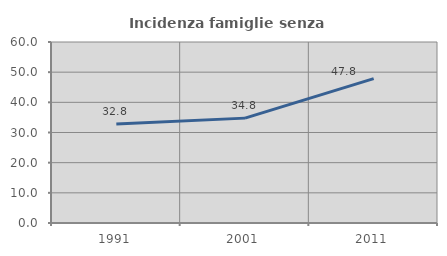
| Category | Incidenza famiglie senza nuclei |
|---|---|
| 1991.0 | 32.781 |
| 2001.0 | 34.766 |
| 2011.0 | 47.843 |